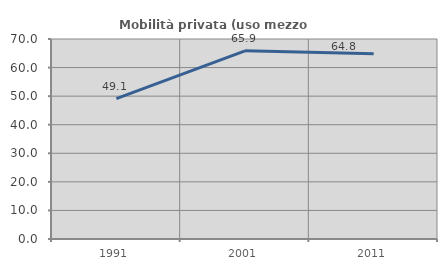
| Category | Mobilità privata (uso mezzo privato) |
|---|---|
| 1991.0 | 49.122 |
| 2001.0 | 65.862 |
| 2011.0 | 64.814 |